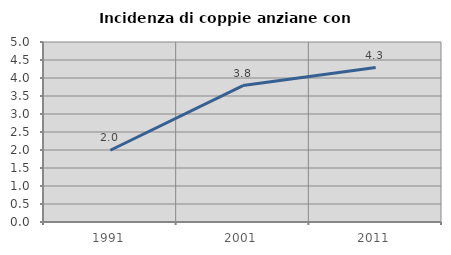
| Category | Incidenza di coppie anziane con figli |
|---|---|
| 1991.0 | 1.994 |
| 2001.0 | 3.791 |
| 2011.0 | 4.289 |